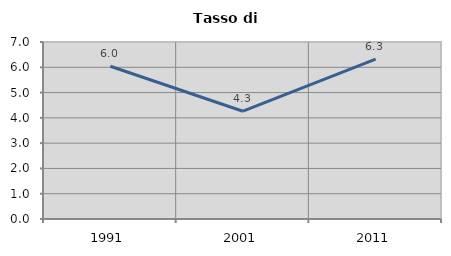
| Category | Tasso di disoccupazione   |
|---|---|
| 1991.0 | 6.041 |
| 2001.0 | 4.262 |
| 2011.0 | 6.325 |